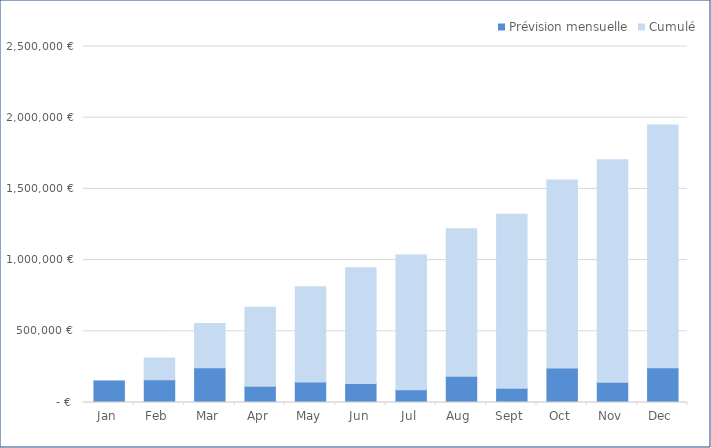
| Category | Prévision mensuelle | Cumulé |
|---|---|---|
| 2020-01-01 | 151600 | 0 |
| 2020-02-01 | 160320 | 151600 |
| 2020-03-01 | 243500 | 311920 |
| 2020-04-01 | 113450 | 555420 |
| 2020-05-01 | 143200 | 668870 |
| 2020-06-01 | 134000 | 812070 |
| 2020-07-01 | 89400 | 946070 |
| 2020-08-01 | 184900 | 1035470 |
| 2020-09-01 | 100800 | 1220370 |
| 2020-10-01 | 241850 | 1321170 |
| 2020-11-01 | 142425 | 1563020 |
| 2020-12-01 | 243400 | 1705445 |